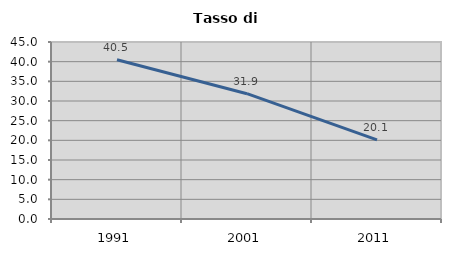
| Category | Tasso di disoccupazione   |
|---|---|
| 1991.0 | 40.494 |
| 2001.0 | 31.861 |
| 2011.0 | 20.108 |